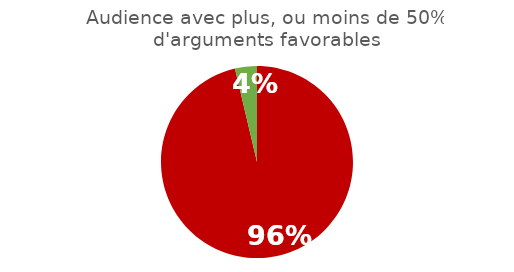
| Category | Series 0 |
|---|---|
| 0 | 0.963 |
| 1 | 0.037 |